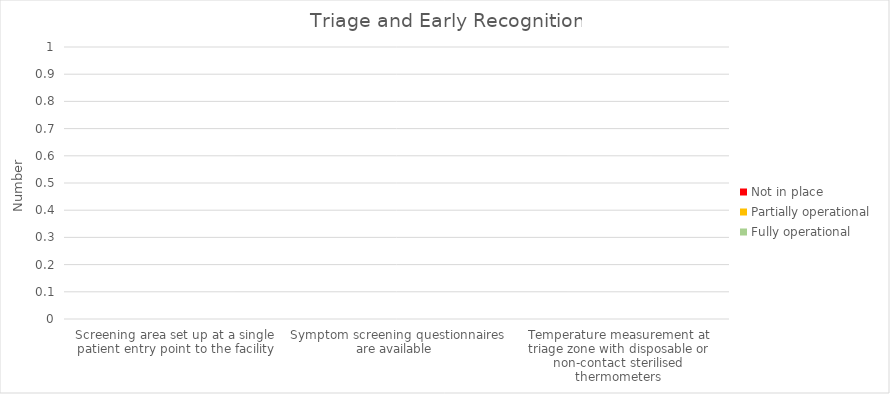
| Category | Fully operational | Partially operational | Not in place |
|---|---|---|---|
| Screening area set up at a single patient entry point to the facility | 0 | 0 | 0 |
| Symptom screening questionnaires are available  | 0 | 0 | 0 |
| Temperature measurement at triage zone with disposable or non-contact sterilised thermometers | 0 | 0 | 0 |